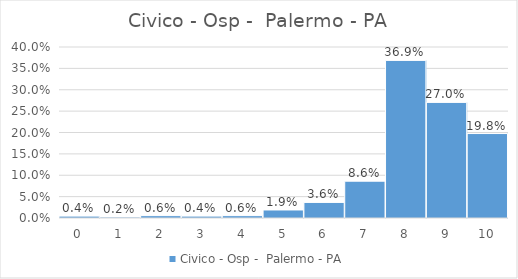
| Category | Civico - Osp -  Palermo - PA |
|---|---|
| 0.0 | 0.004 |
| 1.0 | 0.002 |
| 2.0 | 0.006 |
| 3.0 | 0.004 |
| 4.0 | 0.006 |
| 5.0 | 0.019 |
| 6.0 | 0.036 |
| 7.0 | 0.086 |
| 8.0 | 0.369 |
| 9.0 | 0.27 |
| 10.0 | 0.198 |